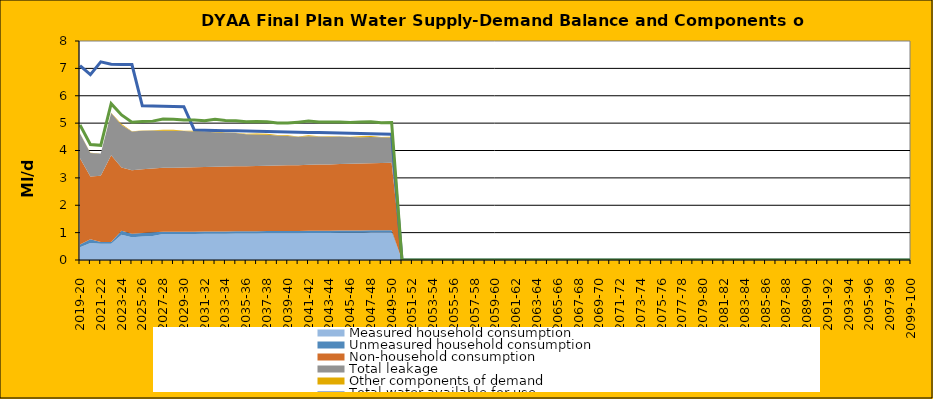
| Category | Total water available for use | Total demand + target headroom (final plan) |
|---|---|---|
| 0 | 7.1 | 4.93 |
| 1 | 6.77 | 4.22 |
| 2 | 7.24 | 4.188 |
| 3 | 7.154 | 5.712 |
| 4 | 7.146 | 5.3 |
| 5 | 7.138 | 5.036 |
| 6 | 5.63 | 5.059 |
| 7 | 5.622 | 5.073 |
| 8 | 5.614 | 5.152 |
| 9 | 5.606 | 5.145 |
| 10 | 5.598 | 5.114 |
| 11 | 4.75 | 5.111 |
| 12 | 4.742 | 5.087 |
| 13 | 4.734 | 5.143 |
| 14 | 4.726 | 5.1 |
| 15 | 4.718 | 5.091 |
| 16 | 4.71 | 5.05 |
| 17 | 4.702 | 5.057 |
| 18 | 4.694 | 5.048 |
| 19 | 4.686 | 5.004 |
| 20 | 4.678 | 5.001 |
| 21 | 4.67 | 5.035 |
| 22 | 4.662 | 5.076 |
| 23 | 4.654 | 5.045 |
| 24 | 4.646 | 5.038 |
| 25 | 4.638 | 5.042 |
| 26 | 4.63 | 5.023 |
| 27 | 4.622 | 5.042 |
| 28 | 4.614 | 5.046 |
| 29 | 4.606 | 5.015 |
| 30 | 4.598 | 5.023 |
| 31 | 0 | 0 |
| 32 | 0 | 0 |
| 33 | 0 | 0 |
| 34 | 0 | 0 |
| 35 | 0 | 0 |
| 36 | 0 | 0 |
| 37 | 0 | 0 |
| 38 | 0 | 0 |
| 39 | 0 | 0 |
| 40 | 0 | 0 |
| 41 | 0 | 0 |
| 42 | 0 | 0 |
| 43 | 0 | 0 |
| 44 | 0 | 0 |
| 45 | 0 | 0 |
| 46 | 0 | 0 |
| 47 | 0 | 0 |
| 48 | 0 | 0 |
| 49 | 0 | 0 |
| 50 | 0 | 0 |
| 51 | 0 | 0 |
| 52 | 0 | 0 |
| 53 | 0 | 0 |
| 54 | 0 | 0 |
| 55 | 0 | 0 |
| 56 | 0 | 0 |
| 57 | 0 | 0 |
| 58 | 0 | 0 |
| 59 | 0 | 0 |
| 60 | 0 | 0 |
| 61 | 0 | 0 |
| 62 | 0 | 0 |
| 63 | 0 | 0 |
| 64 | 0 | 0 |
| 65 | 0 | 0 |
| 66 | 0 | 0 |
| 67 | 0 | 0 |
| 68 | 0 | 0 |
| 69 | 0 | 0 |
| 70 | 0 | 0 |
| 71 | 0 | 0 |
| 72 | 0 | 0 |
| 73 | 0 | 0 |
| 74 | 0 | 0 |
| 75 | 0 | 0 |
| 76 | 0 | 0 |
| 77 | 0 | 0 |
| 78 | 0 | 0 |
| 79 | 0 | 0 |
| 80 | 0 | 0 |